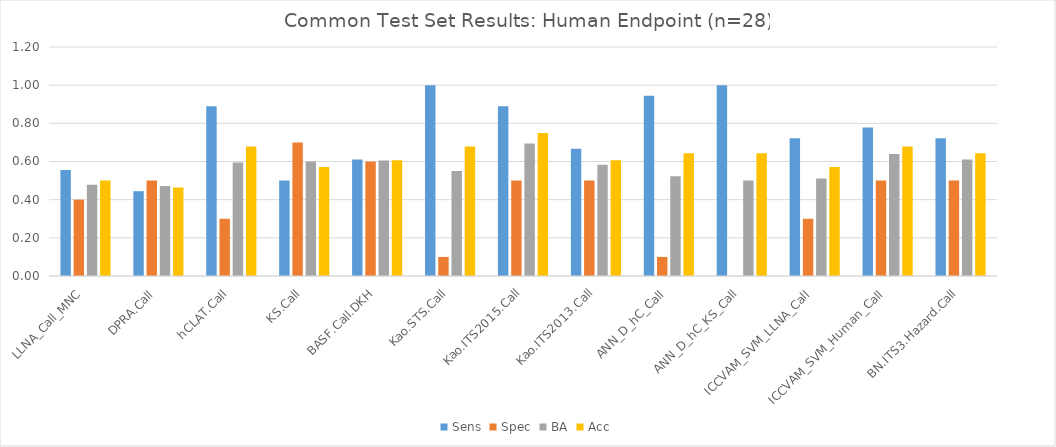
| Category | Sens | Spec | BA | Acc |
|---|---|---|---|---|
| LLNA_Call_MNC | 0.556 | 0.4 | 0.478 | 0.5 |
| DPRA.Call | 0.444 | 0.5 | 0.472 | 0.464 |
| hCLAT.Call | 0.889 | 0.3 | 0.594 | 0.679 |
| KS.Call | 0.5 | 0.7 | 0.6 | 0.571 |
| BASF.Call.DKH | 0.611 | 0.6 | 0.606 | 0.607 |
| Kao.STS.Call | 1 | 0.1 | 0.55 | 0.679 |
| Kao.ITS2015.Call | 0.889 | 0.5 | 0.694 | 0.75 |
| Kao.ITS2013.Call | 0.667 | 0.5 | 0.583 | 0.607 |
| ANN_D_hC_Call | 0.944 | 0.1 | 0.522 | 0.643 |
| ANN_D_hC_KS_Call | 1 | 0 | 0.5 | 0.643 |
| ICCVAM_SVM_LLNA_Call | 0.722 | 0.3 | 0.511 | 0.571 |
| ICCVAM_SVM_Human_Call | 0.778 | 0.5 | 0.639 | 0.679 |
| BN.ITS3.Hazard.Call | 0.722 | 0.5 | 0.611 | 0.643 |